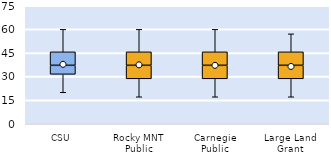
| Category | 25th | 50th | 75th |
|---|---|---|---|
| CSU | 31.429 | 5.714 | 8.571 |
| Rocky MNT Public | 28.571 | 8.571 | 8.571 |
| Carnegie Public | 28.571 | 8.571 | 8.571 |
| Large Land Grant | 28.571 | 8.571 | 8.571 |